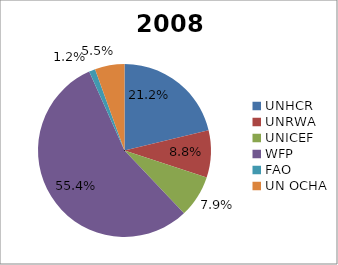
| Category | 2008 |
|---|---|
| UNHCR | 1241.028 |
| UNRWA | 516.567 |
| UNICEF | 460.439 |
| WFP | 3236.658 |
| FAO | 68.124 |
| UN OCHA | 323.388 |